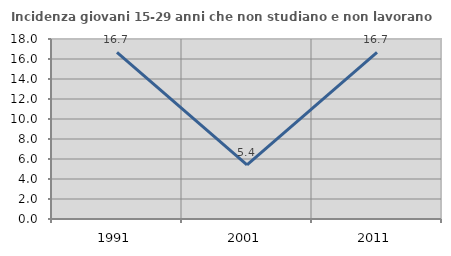
| Category | Incidenza giovani 15-29 anni che non studiano e non lavorano  |
|---|---|
| 1991.0 | 16.667 |
| 2001.0 | 5.405 |
| 2011.0 | 16.667 |